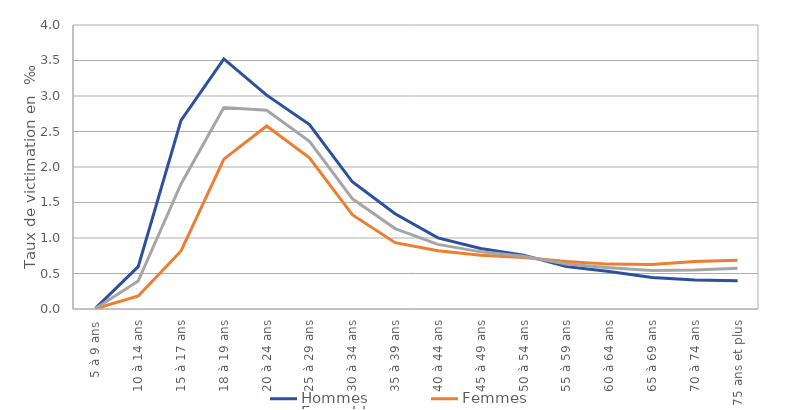
| Category | Hommes | Femmes | Ensemble |
|---|---|---|---|
| 5 à 9 ans | 0.01 | 0.004 | 0.007 |
| 10 à 14 ans | 0.596 | 0.183 | 0.394 |
| 15 à 17 ans | 2.656 | 0.817 | 1.762 |
| 18 à 19 ans | 3.522 | 2.11 | 2.836 |
| 20 à 24 ans | 3.012 | 2.577 | 2.798 |
| 25 à 29 ans | 2.597 | 2.128 | 2.361 |
| 30 à 34 ans | 1.792 | 1.328 | 1.554 |
| 35 à 39 ans | 1.341 | 0.934 | 1.133 |
| 40 à 44 ans | 1.002 | 0.822 | 0.91 |
| 45 à 49 ans | 0.853 | 0.757 | 0.805 |
| 50 à 54 ans | 0.758 | 0.725 | 0.742 |
| 55 à 59 ans | 0.6 | 0.668 | 0.635 |
| 60 à 64 ans | 0.527 | 0.632 | 0.582 |
| 65 à 69 ans | 0.444 | 0.627 | 0.541 |
| 70 à 74 ans | 0.408 | 0.668 | 0.548 |
| 75 ans et plus | 0.399 | 0.686 | 0.574 |